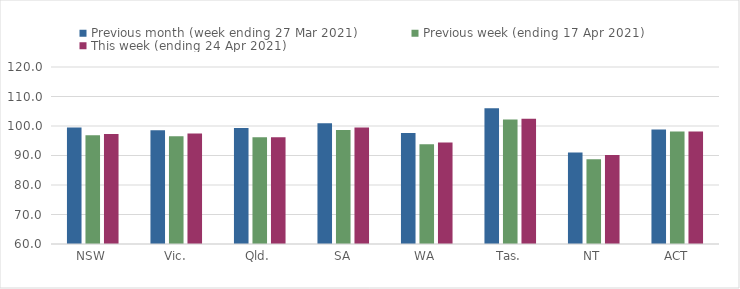
| Category | Previous month (week ending 27 Mar 2021) | Previous week (ending 17 Apr 2021) | This week (ending 24 Apr 2021) |
|---|---|---|---|
| NSW | 99.48 | 96.83 | 97.33 |
| Vic. | 98.54 | 96.49 | 97.42 |
| Qld. | 99.34 | 96.22 | 96.22 |
| SA | 100.94 | 98.65 | 99.5 |
| WA | 97.62 | 93.85 | 94.37 |
| Tas. | 106.03 | 102.17 | 102.42 |
| NT | 91 | 88.74 | 90.16 |
| ACT | 98.79 | 98.12 | 98.12 |